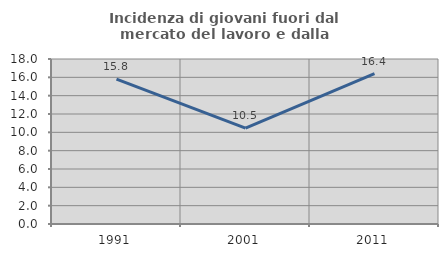
| Category | Incidenza di giovani fuori dal mercato del lavoro e dalla formazione  |
|---|---|
| 1991.0 | 15.799 |
| 2001.0 | 10.459 |
| 2011.0 | 16.404 |